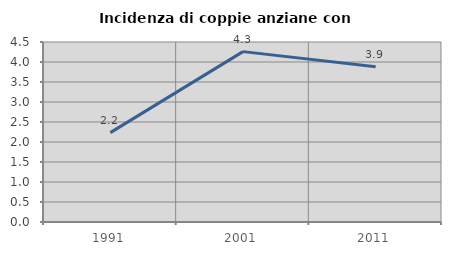
| Category | Incidenza di coppie anziane con figli |
|---|---|
| 1991.0 | 2.235 |
| 2001.0 | 4.259 |
| 2011.0 | 3.879 |